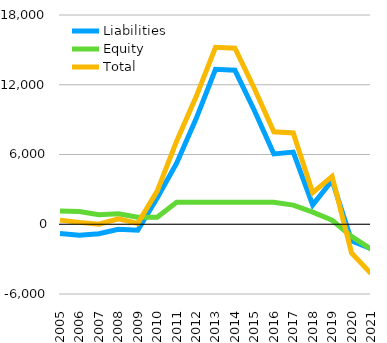
| Category | Liabilities  | Equity  | Total |
|---|---|---|---|
| 2005 | -793.75 | 1148.197 | 354.447 |
| 2006 | -935.527 | 1097.354 | 161.827 |
| 2007 | -816.776 | 824.174 | 7.398 |
| 2008 | -438.873 | 902.436 | 463.563 |
| 2009 | -519.629 | 597.266 | 77.637 |
| 2010 | 2250.381 | 597.266 | 2847.647 |
| 2011 | 5249.871 | 1893.399 | 7143.27 |
| 2012 | 9067.319 | 1893.399 | 10960.718 |
| 2013 | 13325.022 | 1893.399 | 15218.421 |
| 2014 | 13243.991 | 1893.399 | 15137.39 |
| 2015 | 9787.495 | 1893.399 | 11680.894 |
| 2016 | 6053.84 | 1893.399 | 7947.239 |
| 2017 | 6208.921 | 1650.499 | 7859.42 |
| 2018 | 1665.721 | 1047.699 | 2713.42 |
| 2019 | 3765.157 | 347.249 | 4112.406 |
| 2020 | -1425.485 | -1045.751 | -2471.236 |
| 2021 | -2101.485 | -2144.751 | -4246.236 |